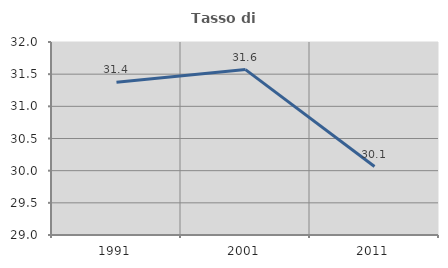
| Category | Tasso di occupazione   |
|---|---|
| 1991.0 | 31.373 |
| 2001.0 | 31.571 |
| 2011.0 | 30.064 |